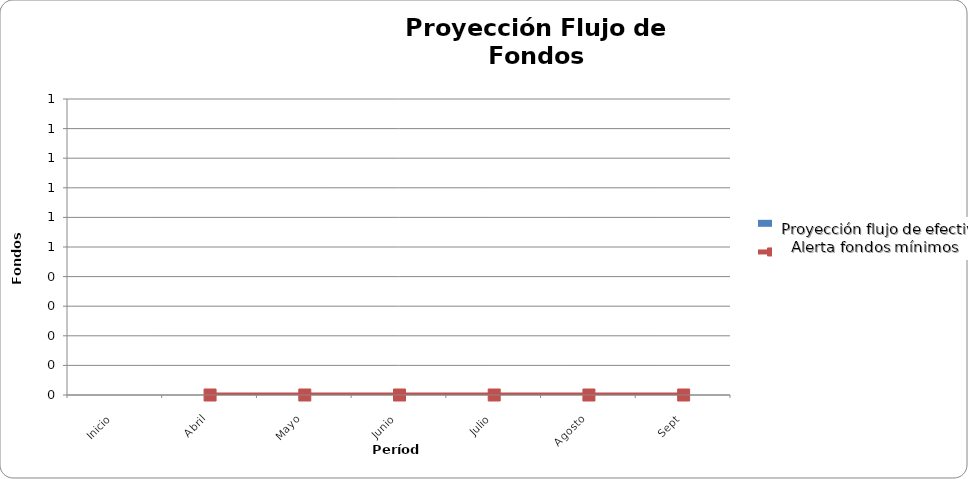
| Category | Cash Flow Projection |
|---|---|
| Inicio | 0 |
| Abril | 0 |
| Mayo | 0 |
| Junio | 0 |
| Julio | 0 |
| Agosto | 0 |
| Sept | 0 |